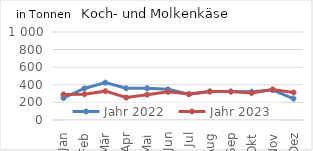
| Category | Jahr 2022 | Jahr 2023 |
|---|---|---|
| Jan | 249.935 | 290.243 |
| Feb | 358.591 | 292.634 |
| Mär | 424.52 | 327.9 |
| Apr | 360.578 | 255.206 |
| Mai | 361.282 | 287.826 |
| Jun | 348.345 | 320.37 |
| Jul | 294.034 | 294.169 |
| Aug | 324.295 | 323.475 |
| Sep | 323.227 | 322.93 |
| Okt | 321.1 | 305.846 |
| Nov | 340.214 | 347.287 |
| Dez | 242.398 | 312.514 |